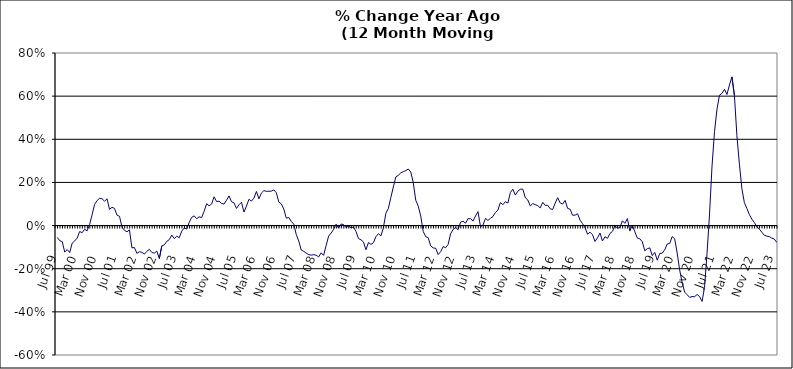
| Category | Series 0 |
|---|---|
| Jul 99 | -0.055 |
| Aug 99 | -0.07 |
| Sep 99 | -0.074 |
| Oct 99 | -0.123 |
| Nov 99 | -0.111 |
| Dec 99 | -0.125 |
| Jan 00 | -0.082 |
| Feb 00 | -0.071 |
| Mar 00 | -0.058 |
| Apr 00 | -0.027 |
| May 00 | -0.033 |
| Jun 00 | -0.017 |
| Jul 00 | -0.025 |
| Aug 00 | 0.005 |
| Sep 00 | 0.05 |
| Oct 00 | 0.098 |
| Nov 00 | 0.116 |
| Dec 00 | 0.127 |
| Jan 01 | 0.124 |
| Feb 01 | 0.113 |
| Mar 01 | 0.124 |
| Apr 01 | 0.075 |
| May 01 | 0.085 |
| Jun 01 | 0.08 |
| Jul 01 | 0.048 |
| Aug 01 | 0.043 |
| Sep 01 | -0.007 |
| Oct 01 | -0.022 |
| Nov 01 | -0.029 |
| Dec 01 | -0.02 |
| Jan 02 | -0.103 |
| Feb 02 | -0.102 |
| Mar 02 | -0.129 |
| Apr 02 | -0.121 |
| May 02 | -0.124 |
| Jun 02 | -0.132 |
| Jul 02 | -0.119 |
| Aug 02 | -0.11 |
| Sep 02 | -0.125 |
| Oct 02 | -0.128 |
| Nov 02 | -0.118 |
| Dec 02 | -0.153 |
| Jan 03 | -0.094 |
| Feb 03 | -0.09 |
| Mar 03 | -0.073 |
| Apr 03 | -0.065 |
| May 03 | -0.044 |
| Jun 03 | -0.06 |
| Jul 03 | -0.049 |
| Aug 03 | -0.056 |
| Sep 03 | -0.026 |
| Oct 03 | -0.012 |
| Nov 03 | -0.016 |
| Dec 03 | 0.014 |
| Jan 04 | 0.038 |
| Feb 04 | 0.045 |
| Mar 04 | 0.032 |
| Apr 04 | 0.041 |
| May 04 | 0.037 |
| Jun 04 | 0.066 |
| Jul 04 | 0.101 |
| Aug 04 | 0.092 |
| Sep 04 | 0.1 |
| Oct 04 | 0.133 |
| Nov 04 | 0.111 |
| Dec 04 | 0.113 |
| Jan 05 | 0.103 |
| Feb 05 | 0.1 |
| Mar 05 | 0.118 |
| Apr 05 | 0.138 |
| May 05 | 0.11 |
| Jun 05 | 0.106 |
| Jul 05 | 0.079 |
| Aug 05 | 0.097 |
| Sep 05 | 0.108 |
| Oct 05 | 0.063 |
| Nov 05 | 0.09 |
| Dec 05 | 0.122 |
| Jan 06 | 0.114 |
| Feb 06 | 0.127 |
| Mar 06 | 0.158 |
| Apr 06 | 0.124 |
| May 06 | 0.151 |
| Jun 06 | 0.162 |
| Jul 06 | 0.159 |
| Aug 06 | 0.159 |
| Sep 06 | 0.16 |
| Oct 06 | 0.166 |
| Nov 06 | 0.152 |
| Dec 06 | 0.109 |
| Jan 07 | 0.101 |
| Feb 07 | 0.076 |
| Mar 07 | 0.034 |
| Apr 07 | 0.038 |
| May 07 | 0.019 |
| Jun 07 | 0.007 |
| Jul 07 | -0.041 |
| Aug 07 | -0.071 |
| Sep 07 | -0.113 |
| Oct 07 | -0.12 |
| Nov 07 | -0.128 |
| Dec 07 | -0.135 |
| Jan 08 | -0.137 |
| Feb 08 | -0.135 |
| Mar 08 | -0.137 |
| Apr 08 | -0.145 |
| May 08 | -0.126 |
| Jun 08 | -0.138 |
| Jul 08 | -0.093 |
| Aug 08 | -0.049 |
| Sep-08 | -0.035 |
| Oct 08 | -0.018 |
| Nov 08 | 0.007 |
| Dec 08 | -0.011 |
| Jan 09 | 0.007 |
| Feb 09 | 0.005 |
| Mar 09 | -0.009 |
| Apr 09 | -0.003 |
| May 09 | -0.01 |
| Jun 09 | -0.007 |
| Jul 09 | -0.027 |
| Aug 09 | -0.06 |
| Sep 09 | -0.066 |
| Oct 09 | -0.076 |
| Nov 09 | -0.112 |
| Dec 09 | -0.079 |
| Jan 10 | -0.087 |
| Feb 10 | -0.079 |
| Mar 10 | -0.052 |
| Apr 10 | -0.037 |
| May 10 | -0.048 |
| Jun 10 | -0.01 |
| Jul 10 | 0.057 |
| Aug 10 | 0.08 |
| Sep 10 | 0.13 |
| Oct 10 | 0.179 |
| Nov 10 | 0.226 |
| Dec 10 | 0.233 |
| Jan 11 | 0.245 |
| Feb 11 | 0.25 |
| Mar 11 | 0.255 |
| Apr 11 | 0.262 |
| May 11 | 0.248 |
| Jun 11 | 0.199 |
| Jul 11 | 0.118 |
| Aug 11 | 0.09 |
| Sep 11 | 0.044 |
| Oct 11 | -0.028 |
| Nov 11 | -0.051 |
| Dec 11 | -0.056 |
| Jan 12 | -0.094 |
| Feb 12 | -0.104 |
| Mar 12 | -0.105 |
| Apr 12 | -0.134 |
| May 12 | -0.121 |
| Jun 12 | -0.098 |
| Jul 12 | -0.103 |
| Aug 12 | -0.087 |
| Sep 12 | -0.038 |
| Oct 12 | -0.018 |
| Nov 12 | -0.009 |
| Dec 12 | -0.019 |
| Jan 13 | 0.016 |
| Feb-13 | 0.02 |
| Mar-13 | 0.011 |
| Apr 13 | 0.032 |
| May 13 | 0.032 |
| Jun-13 | 0.021 |
| Jul 13 | 0.045 |
| Aug 13 | 0.065 |
| Sep 13 | -0.005 |
| Oct 13 | 0.002 |
| Nov 13 | 0.033 |
| Dec 13 | 0.024 |
| Jan 14 | 0.034 |
| Feb-14 | 0.042 |
| Mar 14 | 0.061 |
| Apr 14 | 0.072 |
| May 14 | 0.107 |
| Jun 14 | 0.097 |
| Jul-14 | 0.111 |
| Aug-14 | 0.105 |
| Sep 14 | 0.153 |
| Oct 14 | 0.169 |
| Nov 14 | 0.141 |
| Dec 14 | 0.159 |
| Jan 15 | 0.169 |
| Feb 15 | 0.169 |
| Mar 15 | 0.129 |
| Apr-15 | 0.118 |
| May 15 | 0.091 |
| Jun-15 | 0.102 |
| Jul 15 | 0.097 |
| Aug 15 | 0.092 |
| Sep 15 | 0.082 |
| Oct 15 | 0.108 |
| Nov 15 | 0.093 |
| Dec 15 | 0.094 |
| Jan 16 | 0.078 |
| Feb 16 | 0.075 |
| Mar 16 | 0.104 |
| Apr 16 | 0.129 |
| May 16 | 0.105 |
| Jun 16 | 0.1 |
| Jul 16 | 0.117 |
| Aug 16 | 0.08 |
| Sep 16 | 0.076 |
| Oct 16 | 0.048 |
| Nov 16 | 0.048 |
| Dec 16 | 0.055 |
| Jan 17 | 0.025 |
| Feb 17 | 0.009 |
| Mar 17 | -0.01 |
| Apr 17 | -0.04 |
| May 17 | -0.031 |
| Jun 17 | -0.042 |
| Jul 17 | -0.074 |
| Aug 17 | -0.057 |
| Sep 17 | -0.035 |
| Oct 17 | -0.071 |
| Nov 17 | -0.052 |
| Dec 17 | -0.059 |
| Jan 18 | -0.037 |
| Feb 18 | -0.027 |
| Mar 18 | 0 |
| Apr 18 | -0.012 |
| May 18 | -0.009 |
| Jun 18 | 0.022 |
| Jul 18 | 0.01 |
| Aug 18 | 0.033 |
| Sep 18 | -0.025 |
| Oct 18 | 0.002 |
| Nov 18 | -0.029 |
| Dec 18 | -0.058 |
| Jan 19 | -0.061 |
| Feb 19 | -0.075 |
| Mar 19 | -0.117 |
| Apr 19 | -0.107 |
| May 19 | -0.104 |
| Jun 19 | -0.139 |
| Jul 19 | -0.124 |
| Aug 19 | -0.16 |
| Sep 19 | -0.129 |
| Oct 19 | -0.128 |
| Nov 19 | -0.112 |
| Dec 19 | -0.085 |
| Jan 20 | -0.083 |
| Feb 20 | -0.051 |
| Mar 20 | -0.061 |
| Apr 20 | -0.127 |
| May 20 | -0.206 |
| Jun 20 | -0.264 |
| Jul 20 | -0.308 |
| Aug 20 | -0.32 |
| Sep 20 | -0.333 |
| Oct 20 | -0.329 |
| Nov 20 | -0.33 |
| Dec 20 | -0.319 |
| Jan 21 | -0.329 |
| Feb 21 | -0.352 |
| Mar 21 | -0.286 |
| Apr 21 | -0.129 |
| May 21 | 0.053 |
| Jun 21 | 0.276 |
| Jul 21 | 0.435 |
| Aug 21 | 0.541 |
| Sep 21 | 0.604 |
| Oct 21 | 0.613 |
| Nov 21 | 0.632 |
| Dec 21 | 0.608 |
| Jan 22 | 0.652 |
| Feb 22 | 0.689 |
| Mar 22 | 0.603 |
| Apr 22 | 0.416 |
| May 22 | 0.285 |
| Jun 22 | 0.171 |
| Jul 22 | 0.106 |
| Aug 22 | 0.079 |
| Sep 22 | 0.051 |
| Oct 22 | 0.03 |
| Nov 22 | 0.014 |
| Dec 22 | -0.004 |
| Jan 23 | -0.017 |
| Feb 23 | -0.031 |
| Mar 23 | -0.045 |
| Apr 23 | -0.049 |
| May 23 | -0.051 |
| Jun 23 | -0.058 |
| Jul 23 | -0.062 |
| Aug 23 | -0.078 |